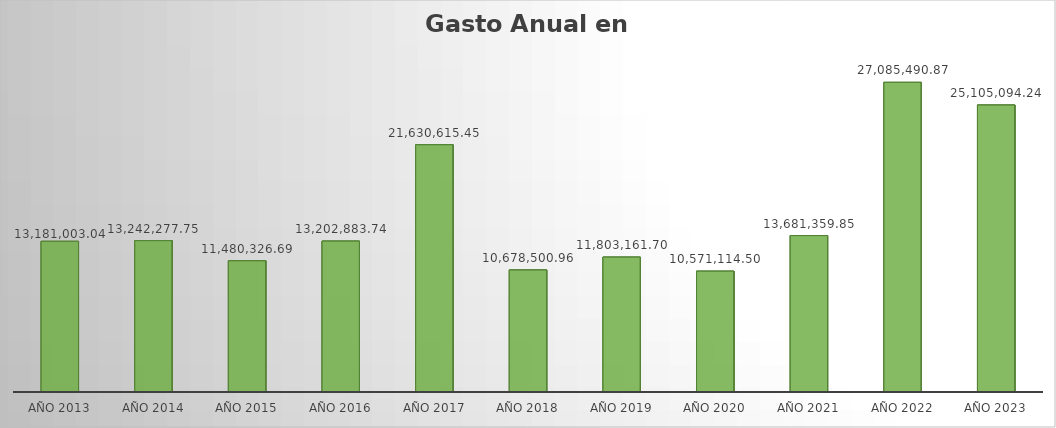
| Category | Monto |
|---|---|
| AÑO 2013 | 13181003.04 |
| AÑO 2014 | 13242277.75 |
| AÑO 2015 | 11480326.69 |
| AÑO 2016 | 13202883.74 |
| AÑO 2017 | 21630615.45 |
| AÑO 2018 | 10678500.96 |
| AÑO 2019 | 11803161.7 |
| AÑO 2020 | 10571114.5 |
| AÑO 2021 | 13681359.85 |
| AÑO 2022 | 27085490.87 |
| AÑO 2023 | 25105094.24 |